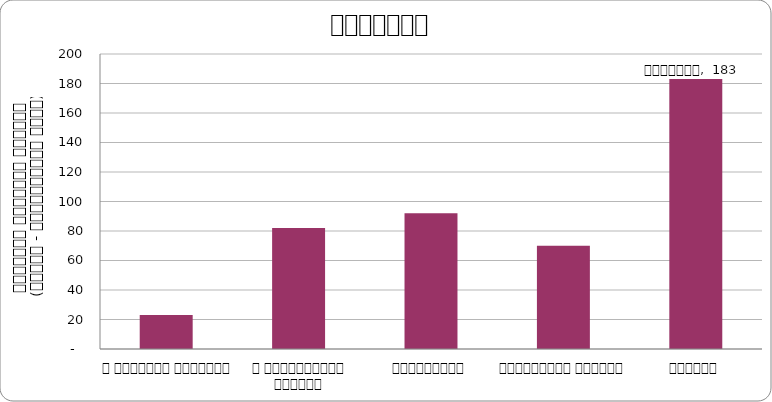
| Category | राजनीति |
|---|---|
| द हिमालयन टाइम्स् | 23 |
| द काठमाण्डौं पोस्ट् | 82 |
| कान्तिपुर | 92 |
| अन्नपूर्ण पोस्ट् | 70 |
| नागरिक | 183 |